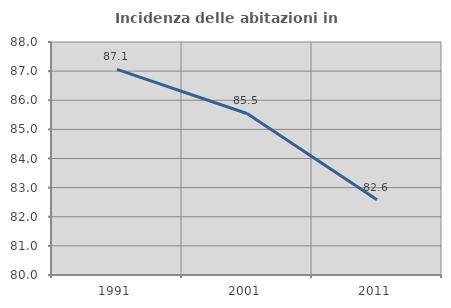
| Category | Incidenza delle abitazioni in proprietà  |
|---|---|
| 1991.0 | 87.059 |
| 2001.0 | 85.546 |
| 2011.0 | 82.583 |